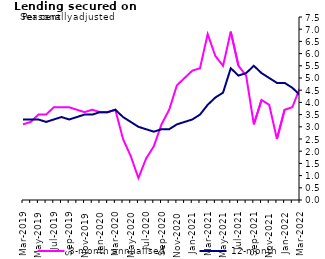
| Category | 3-month annualised | 12-month |
|---|---|---|
| Mar-2019 | 3.1 | 3.3 |
| Apr-2019 | 3.2 | 3.3 |
| May-2019 | 3.5 | 3.3 |
| Jun-2019 | 3.5 | 3.2 |
| Jul-2019 | 3.8 | 3.3 |
| Aug-2019 | 3.8 | 3.4 |
| Sep-2019 | 3.8 | 3.3 |
| Oct-2019 | 3.7 | 3.4 |
| Nov-2019 | 3.6 | 3.5 |
| Dec-2019 | 3.7 | 3.5 |
| Jan-2020 | 3.6 | 3.6 |
| Feb-2020 | 3.6 | 3.6 |
| Mar-2020 | 3.7 | 3.7 |
| Apr-2020 | 2.5 | 3.4 |
| May-2020 | 1.8 | 3.2 |
| Jun-2020 | 0.9 | 3 |
| Jul-2020 | 1.7 | 2.9 |
| Aug-2020 | 2.2 | 2.8 |
| Sep-2020 | 3.1 | 2.9 |
| Oct-2020 | 3.7 | 2.9 |
| Nov-2020 | 4.7 | 3.1 |
| Dec-2020 | 5 | 3.2 |
| Jan-2021 | 5.3 | 3.3 |
| Feb-2021 | 5.4 | 3.5 |
| Mar-2021 | 6.8 | 3.9 |
| Apr-2021 | 5.9 | 4.2 |
| May-2021 | 5.5 | 4.4 |
| Jun-2021 | 6.9 | 5.4 |
| Jul-2021 | 5.5 | 5.1 |
| Aug-2021 | 5.1 | 5.2 |
| Sep-2021 | 3.1 | 5.5 |
| Oct-2021 | 4.1 | 5.2 |
| Nov-2021 | 3.9 | 5 |
| Dec-2021 | 2.5 | 4.8 |
| Jan-2022 | 3.7 | 4.8 |
| Feb-2022 | 3.8 | 4.6 |
| Mar-2022 | 4.6 | 4.3 |